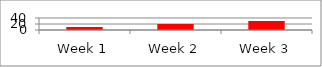
| Category | Series 0 |
|---|---|
| Week 1 | 10 |
| Week 2 | 20 |
| Week 3 | 30 |